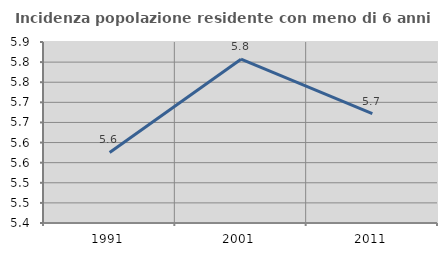
| Category | Incidenza popolazione residente con meno di 6 anni |
|---|---|
| 1991.0 | 5.575 |
| 2001.0 | 5.807 |
| 2011.0 | 5.672 |